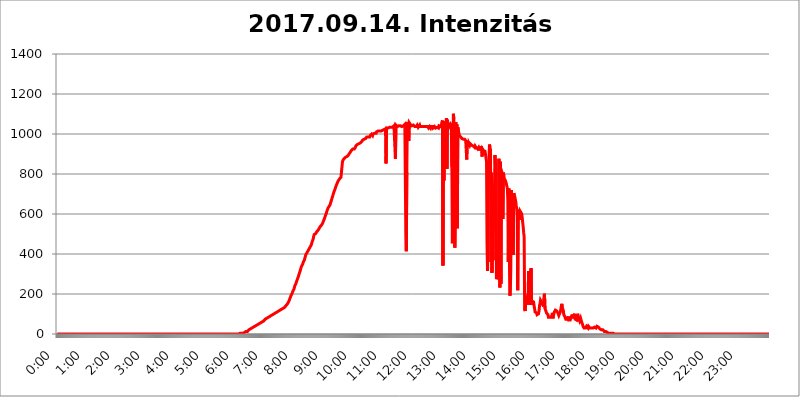
| Category | 2017.09.14. Intenzitás [W/m^2] |
|---|---|
| 0.0 | 0 |
| 0.0006944444444444445 | 0 |
| 0.001388888888888889 | 0 |
| 0.0020833333333333333 | 0 |
| 0.002777777777777778 | 0 |
| 0.003472222222222222 | 0 |
| 0.004166666666666667 | 0 |
| 0.004861111111111111 | 0 |
| 0.005555555555555556 | 0 |
| 0.0062499999999999995 | 0 |
| 0.006944444444444444 | 0 |
| 0.007638888888888889 | 0 |
| 0.008333333333333333 | 0 |
| 0.009027777777777779 | 0 |
| 0.009722222222222222 | 0 |
| 0.010416666666666666 | 0 |
| 0.011111111111111112 | 0 |
| 0.011805555555555555 | 0 |
| 0.012499999999999999 | 0 |
| 0.013194444444444444 | 0 |
| 0.013888888888888888 | 0 |
| 0.014583333333333332 | 0 |
| 0.015277777777777777 | 0 |
| 0.015972222222222224 | 0 |
| 0.016666666666666666 | 0 |
| 0.017361111111111112 | 0 |
| 0.018055555555555557 | 0 |
| 0.01875 | 0 |
| 0.019444444444444445 | 0 |
| 0.02013888888888889 | 0 |
| 0.020833333333333332 | 0 |
| 0.02152777777777778 | 0 |
| 0.022222222222222223 | 0 |
| 0.02291666666666667 | 0 |
| 0.02361111111111111 | 0 |
| 0.024305555555555556 | 0 |
| 0.024999999999999998 | 0 |
| 0.025694444444444447 | 0 |
| 0.02638888888888889 | 0 |
| 0.027083333333333334 | 0 |
| 0.027777777777777776 | 0 |
| 0.02847222222222222 | 0 |
| 0.029166666666666664 | 0 |
| 0.029861111111111113 | 0 |
| 0.030555555555555555 | 0 |
| 0.03125 | 0 |
| 0.03194444444444445 | 0 |
| 0.03263888888888889 | 0 |
| 0.03333333333333333 | 0 |
| 0.034027777777777775 | 0 |
| 0.034722222222222224 | 0 |
| 0.035416666666666666 | 0 |
| 0.036111111111111115 | 0 |
| 0.03680555555555556 | 0 |
| 0.0375 | 0 |
| 0.03819444444444444 | 0 |
| 0.03888888888888889 | 0 |
| 0.03958333333333333 | 0 |
| 0.04027777777777778 | 0 |
| 0.04097222222222222 | 0 |
| 0.041666666666666664 | 0 |
| 0.042361111111111106 | 0 |
| 0.04305555555555556 | 0 |
| 0.043750000000000004 | 0 |
| 0.044444444444444446 | 0 |
| 0.04513888888888889 | 0 |
| 0.04583333333333334 | 0 |
| 0.04652777777777778 | 0 |
| 0.04722222222222222 | 0 |
| 0.04791666666666666 | 0 |
| 0.04861111111111111 | 0 |
| 0.049305555555555554 | 0 |
| 0.049999999999999996 | 0 |
| 0.05069444444444445 | 0 |
| 0.051388888888888894 | 0 |
| 0.052083333333333336 | 0 |
| 0.05277777777777778 | 0 |
| 0.05347222222222222 | 0 |
| 0.05416666666666667 | 0 |
| 0.05486111111111111 | 0 |
| 0.05555555555555555 | 0 |
| 0.05625 | 0 |
| 0.05694444444444444 | 0 |
| 0.057638888888888885 | 0 |
| 0.05833333333333333 | 0 |
| 0.05902777777777778 | 0 |
| 0.059722222222222225 | 0 |
| 0.06041666666666667 | 0 |
| 0.061111111111111116 | 0 |
| 0.06180555555555556 | 0 |
| 0.0625 | 0 |
| 0.06319444444444444 | 0 |
| 0.06388888888888888 | 0 |
| 0.06458333333333334 | 0 |
| 0.06527777777777778 | 0 |
| 0.06597222222222222 | 0 |
| 0.06666666666666667 | 0 |
| 0.06736111111111111 | 0 |
| 0.06805555555555555 | 0 |
| 0.06874999999999999 | 0 |
| 0.06944444444444443 | 0 |
| 0.07013888888888889 | 0 |
| 0.07083333333333333 | 0 |
| 0.07152777777777779 | 0 |
| 0.07222222222222223 | 0 |
| 0.07291666666666667 | 0 |
| 0.07361111111111111 | 0 |
| 0.07430555555555556 | 0 |
| 0.075 | 0 |
| 0.07569444444444444 | 0 |
| 0.0763888888888889 | 0 |
| 0.07708333333333334 | 0 |
| 0.07777777777777778 | 0 |
| 0.07847222222222222 | 0 |
| 0.07916666666666666 | 0 |
| 0.0798611111111111 | 0 |
| 0.08055555555555556 | 0 |
| 0.08125 | 0 |
| 0.08194444444444444 | 0 |
| 0.08263888888888889 | 0 |
| 0.08333333333333333 | 0 |
| 0.08402777777777777 | 0 |
| 0.08472222222222221 | 0 |
| 0.08541666666666665 | 0 |
| 0.08611111111111112 | 0 |
| 0.08680555555555557 | 0 |
| 0.08750000000000001 | 0 |
| 0.08819444444444445 | 0 |
| 0.08888888888888889 | 0 |
| 0.08958333333333333 | 0 |
| 0.09027777777777778 | 0 |
| 0.09097222222222222 | 0 |
| 0.09166666666666667 | 0 |
| 0.09236111111111112 | 0 |
| 0.09305555555555556 | 0 |
| 0.09375 | 0 |
| 0.09444444444444444 | 0 |
| 0.09513888888888888 | 0 |
| 0.09583333333333333 | 0 |
| 0.09652777777777777 | 0 |
| 0.09722222222222222 | 0 |
| 0.09791666666666667 | 0 |
| 0.09861111111111111 | 0 |
| 0.09930555555555555 | 0 |
| 0.09999999999999999 | 0 |
| 0.10069444444444443 | 0 |
| 0.1013888888888889 | 0 |
| 0.10208333333333335 | 0 |
| 0.10277777777777779 | 0 |
| 0.10347222222222223 | 0 |
| 0.10416666666666667 | 0 |
| 0.10486111111111111 | 0 |
| 0.10555555555555556 | 0 |
| 0.10625 | 0 |
| 0.10694444444444444 | 0 |
| 0.1076388888888889 | 0 |
| 0.10833333333333334 | 0 |
| 0.10902777777777778 | 0 |
| 0.10972222222222222 | 0 |
| 0.1111111111111111 | 0 |
| 0.11180555555555556 | 0 |
| 0.11180555555555556 | 0 |
| 0.1125 | 0 |
| 0.11319444444444444 | 0 |
| 0.11388888888888889 | 0 |
| 0.11458333333333333 | 0 |
| 0.11527777777777777 | 0 |
| 0.11597222222222221 | 0 |
| 0.11666666666666665 | 0 |
| 0.1173611111111111 | 0 |
| 0.11805555555555557 | 0 |
| 0.11944444444444445 | 0 |
| 0.12013888888888889 | 0 |
| 0.12083333333333333 | 0 |
| 0.12152777777777778 | 0 |
| 0.12222222222222223 | 0 |
| 0.12291666666666667 | 0 |
| 0.12291666666666667 | 0 |
| 0.12361111111111112 | 0 |
| 0.12430555555555556 | 0 |
| 0.125 | 0 |
| 0.12569444444444444 | 0 |
| 0.12638888888888888 | 0 |
| 0.12708333333333333 | 0 |
| 0.16875 | 0 |
| 0.12847222222222224 | 0 |
| 0.12916666666666668 | 0 |
| 0.12986111111111112 | 0 |
| 0.13055555555555556 | 0 |
| 0.13125 | 0 |
| 0.13194444444444445 | 0 |
| 0.1326388888888889 | 0 |
| 0.13333333333333333 | 0 |
| 0.13402777777777777 | 0 |
| 0.13402777777777777 | 0 |
| 0.13472222222222222 | 0 |
| 0.13541666666666666 | 0 |
| 0.1361111111111111 | 0 |
| 0.13749999999999998 | 0 |
| 0.13819444444444443 | 0 |
| 0.1388888888888889 | 0 |
| 0.13958333333333334 | 0 |
| 0.14027777777777778 | 0 |
| 0.14097222222222222 | 0 |
| 0.14166666666666666 | 0 |
| 0.1423611111111111 | 0 |
| 0.14305555555555557 | 0 |
| 0.14375000000000002 | 0 |
| 0.14444444444444446 | 0 |
| 0.1451388888888889 | 0 |
| 0.1451388888888889 | 0 |
| 0.14652777777777778 | 0 |
| 0.14722222222222223 | 0 |
| 0.14791666666666667 | 0 |
| 0.1486111111111111 | 0 |
| 0.14930555555555555 | 0 |
| 0.15 | 0 |
| 0.15069444444444444 | 0 |
| 0.15138888888888888 | 0 |
| 0.15208333333333332 | 0 |
| 0.15277777777777776 | 0 |
| 0.15347222222222223 | 0 |
| 0.15416666666666667 | 0 |
| 0.15486111111111112 | 0 |
| 0.15555555555555556 | 0 |
| 0.15625 | 0 |
| 0.15694444444444444 | 0 |
| 0.15763888888888888 | 0 |
| 0.15833333333333333 | 0 |
| 0.15902777777777777 | 0 |
| 0.15972222222222224 | 0 |
| 0.16041666666666668 | 0 |
| 0.16111111111111112 | 0 |
| 0.16180555555555556 | 0 |
| 0.1625 | 0 |
| 0.16319444444444445 | 0 |
| 0.1638888888888889 | 0 |
| 0.16458333333333333 | 0 |
| 0.16527777777777777 | 0 |
| 0.16597222222222222 | 0 |
| 0.16666666666666666 | 0 |
| 0.1673611111111111 | 0 |
| 0.16805555555555554 | 0 |
| 0.16874999999999998 | 0 |
| 0.16944444444444443 | 0 |
| 0.17013888888888887 | 0 |
| 0.1708333333333333 | 0 |
| 0.17152777777777775 | 0 |
| 0.17222222222222225 | 0 |
| 0.1729166666666667 | 0 |
| 0.17361111111111113 | 0 |
| 0.17430555555555557 | 0 |
| 0.17500000000000002 | 0 |
| 0.17569444444444446 | 0 |
| 0.1763888888888889 | 0 |
| 0.17708333333333334 | 0 |
| 0.17777777777777778 | 0 |
| 0.17847222222222223 | 0 |
| 0.17916666666666667 | 0 |
| 0.1798611111111111 | 0 |
| 0.18055555555555555 | 0 |
| 0.18125 | 0 |
| 0.18194444444444444 | 0 |
| 0.1826388888888889 | 0 |
| 0.18333333333333335 | 0 |
| 0.1840277777777778 | 0 |
| 0.18472222222222223 | 0 |
| 0.18541666666666667 | 0 |
| 0.18611111111111112 | 0 |
| 0.18680555555555556 | 0 |
| 0.1875 | 0 |
| 0.18819444444444444 | 0 |
| 0.18888888888888888 | 0 |
| 0.18958333333333333 | 0 |
| 0.19027777777777777 | 0 |
| 0.1909722222222222 | 0 |
| 0.19166666666666665 | 0 |
| 0.19236111111111112 | 0 |
| 0.19305555555555554 | 0 |
| 0.19375 | 0 |
| 0.19444444444444445 | 0 |
| 0.1951388888888889 | 0 |
| 0.19583333333333333 | 0 |
| 0.19652777777777777 | 0 |
| 0.19722222222222222 | 0 |
| 0.19791666666666666 | 0 |
| 0.1986111111111111 | 0 |
| 0.19930555555555554 | 0 |
| 0.19999999999999998 | 0 |
| 0.20069444444444443 | 0 |
| 0.20138888888888887 | 0 |
| 0.2020833333333333 | 0 |
| 0.2027777777777778 | 0 |
| 0.2034722222222222 | 0 |
| 0.2041666666666667 | 0 |
| 0.20486111111111113 | 0 |
| 0.20555555555555557 | 0 |
| 0.20625000000000002 | 0 |
| 0.20694444444444446 | 0 |
| 0.2076388888888889 | 0 |
| 0.20833333333333334 | 0 |
| 0.20902777777777778 | 0 |
| 0.20972222222222223 | 0 |
| 0.21041666666666667 | 0 |
| 0.2111111111111111 | 0 |
| 0.21180555555555555 | 0 |
| 0.2125 | 0 |
| 0.21319444444444444 | 0 |
| 0.2138888888888889 | 0 |
| 0.21458333333333335 | 0 |
| 0.2152777777777778 | 0 |
| 0.21597222222222223 | 0 |
| 0.21666666666666667 | 0 |
| 0.21736111111111112 | 0 |
| 0.21805555555555556 | 0 |
| 0.21875 | 0 |
| 0.21944444444444444 | 0 |
| 0.22013888888888888 | 0 |
| 0.22083333333333333 | 0 |
| 0.22152777777777777 | 0 |
| 0.2222222222222222 | 0 |
| 0.22291666666666665 | 0 |
| 0.2236111111111111 | 0 |
| 0.22430555555555556 | 0 |
| 0.225 | 0 |
| 0.22569444444444445 | 0 |
| 0.2263888888888889 | 0 |
| 0.22708333333333333 | 0 |
| 0.22777777777777777 | 0 |
| 0.22847222222222222 | 0 |
| 0.22916666666666666 | 0 |
| 0.2298611111111111 | 0 |
| 0.23055555555555554 | 0 |
| 0.23124999999999998 | 0 |
| 0.23194444444444443 | 0 |
| 0.23263888888888887 | 0 |
| 0.2333333333333333 | 0 |
| 0.2340277777777778 | 0 |
| 0.2347222222222222 | 0 |
| 0.2354166666666667 | 0 |
| 0.23611111111111113 | 0 |
| 0.23680555555555557 | 0 |
| 0.23750000000000002 | 0 |
| 0.23819444444444446 | 0 |
| 0.2388888888888889 | 0 |
| 0.23958333333333334 | 0 |
| 0.24027777777777778 | 0 |
| 0.24097222222222223 | 0 |
| 0.24166666666666667 | 0 |
| 0.2423611111111111 | 0 |
| 0.24305555555555555 | 0 |
| 0.24375 | 0 |
| 0.24444444444444446 | 0 |
| 0.24513888888888888 | 0 |
| 0.24583333333333335 | 0 |
| 0.2465277777777778 | 0 |
| 0.24722222222222223 | 0 |
| 0.24791666666666667 | 0 |
| 0.24861111111111112 | 0 |
| 0.24930555555555556 | 0 |
| 0.25 | 0 |
| 0.25069444444444444 | 0 |
| 0.2513888888888889 | 0 |
| 0.2520833333333333 | 0 |
| 0.25277777777777777 | 0 |
| 0.2534722222222222 | 0 |
| 0.25416666666666665 | 0 |
| 0.2548611111111111 | 3.525 |
| 0.2555555555555556 | 3.525 |
| 0.25625000000000003 | 3.525 |
| 0.2569444444444445 | 3.525 |
| 0.2576388888888889 | 3.525 |
| 0.25833333333333336 | 3.525 |
| 0.2590277777777778 | 3.525 |
| 0.25972222222222224 | 3.525 |
| 0.2604166666666667 | 3.525 |
| 0.2611111111111111 | 3.525 |
| 0.26180555555555557 | 7.887 |
| 0.2625 | 7.887 |
| 0.26319444444444445 | 7.887 |
| 0.2638888888888889 | 7.887 |
| 0.26458333333333334 | 12.257 |
| 0.2652777777777778 | 12.257 |
| 0.2659722222222222 | 12.257 |
| 0.26666666666666666 | 12.257 |
| 0.2673611111111111 | 16.636 |
| 0.26805555555555555 | 16.636 |
| 0.26875 | 21.024 |
| 0.26944444444444443 | 21.024 |
| 0.2701388888888889 | 21.024 |
| 0.2708333333333333 | 25.419 |
| 0.27152777777777776 | 25.419 |
| 0.2722222222222222 | 25.419 |
| 0.27291666666666664 | 29.823 |
| 0.2736111111111111 | 29.823 |
| 0.2743055555555555 | 29.823 |
| 0.27499999999999997 | 34.234 |
| 0.27569444444444446 | 34.234 |
| 0.27638888888888885 | 34.234 |
| 0.27708333333333335 | 38.653 |
| 0.2777777777777778 | 38.653 |
| 0.27847222222222223 | 38.653 |
| 0.2791666666666667 | 43.079 |
| 0.2798611111111111 | 43.079 |
| 0.28055555555555556 | 43.079 |
| 0.28125 | 47.511 |
| 0.28194444444444444 | 47.511 |
| 0.2826388888888889 | 47.511 |
| 0.2833333333333333 | 51.951 |
| 0.28402777777777777 | 56.398 |
| 0.2847222222222222 | 56.398 |
| 0.28541666666666665 | 56.398 |
| 0.28611111111111115 | 56.398 |
| 0.28680555555555554 | 60.85 |
| 0.28750000000000003 | 60.85 |
| 0.2881944444444445 | 65.31 |
| 0.2888888888888889 | 65.31 |
| 0.28958333333333336 | 65.31 |
| 0.2902777777777778 | 69.775 |
| 0.29097222222222224 | 69.775 |
| 0.2916666666666667 | 74.246 |
| 0.2923611111111111 | 74.246 |
| 0.29305555555555557 | 74.246 |
| 0.29375 | 78.722 |
| 0.29444444444444445 | 78.722 |
| 0.2951388888888889 | 83.205 |
| 0.29583333333333334 | 83.205 |
| 0.2965277777777778 | 83.205 |
| 0.2972222222222222 | 83.205 |
| 0.29791666666666666 | 87.692 |
| 0.2986111111111111 | 87.692 |
| 0.29930555555555555 | 92.184 |
| 0.3 | 92.184 |
| 0.30069444444444443 | 92.184 |
| 0.3013888888888889 | 92.184 |
| 0.3020833333333333 | 96.682 |
| 0.30277777777777776 | 96.682 |
| 0.3034722222222222 | 101.184 |
| 0.30416666666666664 | 101.184 |
| 0.3048611111111111 | 101.184 |
| 0.3055555555555555 | 105.69 |
| 0.30624999999999997 | 105.69 |
| 0.3069444444444444 | 105.69 |
| 0.3076388888888889 | 110.201 |
| 0.30833333333333335 | 110.201 |
| 0.3090277777777778 | 114.716 |
| 0.30972222222222223 | 114.716 |
| 0.3104166666666667 | 114.716 |
| 0.3111111111111111 | 119.235 |
| 0.31180555555555556 | 119.235 |
| 0.3125 | 119.235 |
| 0.31319444444444444 | 119.235 |
| 0.3138888888888889 | 123.758 |
| 0.3145833333333333 | 123.758 |
| 0.31527777777777777 | 128.284 |
| 0.3159722222222222 | 128.284 |
| 0.31666666666666665 | 128.284 |
| 0.31736111111111115 | 128.284 |
| 0.31805555555555554 | 132.814 |
| 0.31875000000000003 | 132.814 |
| 0.3194444444444445 | 137.347 |
| 0.3201388888888889 | 137.347 |
| 0.32083333333333336 | 141.884 |
| 0.3215277777777778 | 141.884 |
| 0.32222222222222224 | 146.423 |
| 0.3229166666666667 | 150.964 |
| 0.3236111111111111 | 155.509 |
| 0.32430555555555557 | 155.509 |
| 0.325 | 164.605 |
| 0.32569444444444445 | 169.156 |
| 0.3263888888888889 | 178.264 |
| 0.32708333333333334 | 182.82 |
| 0.3277777777777778 | 191.937 |
| 0.3284722222222222 | 196.497 |
| 0.32916666666666666 | 201.058 |
| 0.3298611111111111 | 205.62 |
| 0.33055555555555555 | 214.746 |
| 0.33125 | 219.309 |
| 0.33194444444444443 | 223.873 |
| 0.3326388888888889 | 233 |
| 0.3333333333333333 | 242.127 |
| 0.3340277777777778 | 246.689 |
| 0.3347222222222222 | 251.251 |
| 0.3354166666666667 | 260.373 |
| 0.3361111111111111 | 264.932 |
| 0.3368055555555556 | 274.047 |
| 0.33749999999999997 | 278.603 |
| 0.33819444444444446 | 287.709 |
| 0.33888888888888885 | 296.808 |
| 0.33958333333333335 | 301.354 |
| 0.34027777777777773 | 310.44 |
| 0.34097222222222223 | 319.517 |
| 0.3416666666666666 | 328.584 |
| 0.3423611111111111 | 333.113 |
| 0.3430555555555555 | 342.162 |
| 0.34375 | 346.682 |
| 0.3444444444444445 | 351.198 |
| 0.3451388888888889 | 360.221 |
| 0.3458333333333334 | 364.728 |
| 0.34652777777777777 | 369.23 |
| 0.34722222222222227 | 378.224 |
| 0.34791666666666665 | 387.202 |
| 0.34861111111111115 | 396.164 |
| 0.34930555555555554 | 400.638 |
| 0.35000000000000003 | 405.108 |
| 0.3506944444444444 | 409.574 |
| 0.3513888888888889 | 414.035 |
| 0.3520833333333333 | 414.035 |
| 0.3527777777777778 | 418.492 |
| 0.3534722222222222 | 427.39 |
| 0.3541666666666667 | 431.833 |
| 0.3548611111111111 | 436.27 |
| 0.35555555555555557 | 440.702 |
| 0.35625 | 445.129 |
| 0.35694444444444445 | 453.968 |
| 0.3576388888888889 | 462.786 |
| 0.35833333333333334 | 467.187 |
| 0.3590277777777778 | 475.972 |
| 0.3597222222222222 | 489.108 |
| 0.36041666666666666 | 497.836 |
| 0.3611111111111111 | 497.836 |
| 0.36180555555555555 | 497.836 |
| 0.3625 | 502.192 |
| 0.36319444444444443 | 506.542 |
| 0.3638888888888889 | 510.885 |
| 0.3645833333333333 | 515.223 |
| 0.3652777777777778 | 515.223 |
| 0.3659722222222222 | 519.555 |
| 0.3666666666666667 | 523.88 |
| 0.3673611111111111 | 528.2 |
| 0.3680555555555556 | 532.513 |
| 0.36874999999999997 | 536.82 |
| 0.36944444444444446 | 536.82 |
| 0.37013888888888885 | 541.121 |
| 0.37083333333333335 | 545.416 |
| 0.37152777777777773 | 545.416 |
| 0.37222222222222223 | 553.986 |
| 0.3729166666666666 | 558.261 |
| 0.3736111111111111 | 566.793 |
| 0.3743055555555555 | 571.049 |
| 0.375 | 579.542 |
| 0.3756944444444445 | 588.009 |
| 0.3763888888888889 | 592.233 |
| 0.3770833333333334 | 600.661 |
| 0.37777777777777777 | 609.062 |
| 0.37847222222222227 | 617.436 |
| 0.37916666666666665 | 621.613 |
| 0.37986111111111115 | 629.948 |
| 0.38055555555555554 | 634.105 |
| 0.38125000000000003 | 638.256 |
| 0.3819444444444444 | 642.4 |
| 0.3826388888888889 | 646.537 |
| 0.3833333333333333 | 654.791 |
| 0.3840277777777778 | 663.019 |
| 0.3847222222222222 | 671.22 |
| 0.3854166666666667 | 675.311 |
| 0.3861111111111111 | 687.544 |
| 0.38680555555555557 | 695.666 |
| 0.3875 | 703.762 |
| 0.38819444444444445 | 711.832 |
| 0.3888888888888889 | 715.858 |
| 0.38958333333333334 | 723.889 |
| 0.3902777777777778 | 727.896 |
| 0.3909722222222222 | 739.877 |
| 0.39166666666666666 | 743.859 |
| 0.3923611111111111 | 751.803 |
| 0.39305555555555555 | 755.766 |
| 0.39375 | 763.674 |
| 0.39444444444444443 | 763.674 |
| 0.3951388888888889 | 767.62 |
| 0.3958333333333333 | 775.492 |
| 0.3965277777777778 | 775.492 |
| 0.3972222222222222 | 779.42 |
| 0.3979166666666667 | 783.342 |
| 0.3986111111111111 | 783.342 |
| 0.3993055555555556 | 787.258 |
| 0.39999999999999997 | 860.676 |
| 0.40069444444444446 | 868.305 |
| 0.40138888888888885 | 868.305 |
| 0.40208333333333335 | 875.918 |
| 0.40277777777777773 | 879.719 |
| 0.40347222222222223 | 879.719 |
| 0.4041666666666666 | 883.516 |
| 0.4048611111111111 | 883.516 |
| 0.4055555555555555 | 887.309 |
| 0.40625 | 887.309 |
| 0.4069444444444445 | 887.309 |
| 0.4076388888888889 | 891.099 |
| 0.4083333333333334 | 894.885 |
| 0.40902777777777777 | 898.668 |
| 0.40972222222222227 | 902.447 |
| 0.41041666666666665 | 906.223 |
| 0.41111111111111115 | 909.996 |
| 0.41180555555555554 | 913.766 |
| 0.41250000000000003 | 917.534 |
| 0.4131944444444444 | 917.534 |
| 0.4138888888888889 | 921.298 |
| 0.4145833333333333 | 925.06 |
| 0.4152777777777778 | 925.06 |
| 0.4159722222222222 | 925.06 |
| 0.4166666666666667 | 925.06 |
| 0.4173611111111111 | 928.819 |
| 0.41805555555555557 | 932.576 |
| 0.41875 | 940.082 |
| 0.41944444444444445 | 936.33 |
| 0.4201388888888889 | 940.082 |
| 0.42083333333333334 | 947.58 |
| 0.4215277777777778 | 947.58 |
| 0.4222222222222222 | 947.58 |
| 0.42291666666666666 | 951.327 |
| 0.4236111111111111 | 955.071 |
| 0.42430555555555555 | 955.071 |
| 0.425 | 955.071 |
| 0.42569444444444443 | 955.071 |
| 0.4263888888888889 | 958.814 |
| 0.4270833333333333 | 962.555 |
| 0.4277777777777778 | 966.295 |
| 0.4284722222222222 | 970.034 |
| 0.4291666666666667 | 970.034 |
| 0.4298611111111111 | 970.034 |
| 0.4305555555555556 | 973.772 |
| 0.43124999999999997 | 970.034 |
| 0.43194444444444446 | 977.508 |
| 0.43263888888888885 | 977.508 |
| 0.43333333333333335 | 977.508 |
| 0.43402777777777773 | 984.98 |
| 0.43472222222222223 | 984.98 |
| 0.4354166666666666 | 984.98 |
| 0.4361111111111111 | 984.98 |
| 0.4368055555555555 | 988.714 |
| 0.4375 | 988.714 |
| 0.4381944444444445 | 984.98 |
| 0.4388888888888889 | 992.448 |
| 0.4395833333333334 | 988.714 |
| 0.44027777777777777 | 992.448 |
| 0.44097222222222227 | 999.916 |
| 0.44166666666666665 | 999.916 |
| 0.44236111111111115 | 992.448 |
| 0.44305555555555554 | 999.916 |
| 0.44375000000000003 | 999.916 |
| 0.4444444444444444 | 999.916 |
| 0.4451388888888889 | 1003.65 |
| 0.4458333333333333 | 1003.65 |
| 0.4465277777777778 | 1003.65 |
| 0.4472222222222222 | 1003.65 |
| 0.4479166666666667 | 1011.118 |
| 0.4486111111111111 | 1011.118 |
| 0.44930555555555557 | 1011.118 |
| 0.45 | 1014.852 |
| 0.45069444444444445 | 1014.852 |
| 0.4513888888888889 | 1011.118 |
| 0.45208333333333334 | 1014.852 |
| 0.4527777777777778 | 1014.852 |
| 0.4534722222222222 | 1018.587 |
| 0.45416666666666666 | 1014.852 |
| 0.4548611111111111 | 1014.852 |
| 0.45555555555555555 | 1018.587 |
| 0.45625 | 1018.587 |
| 0.45694444444444443 | 1018.587 |
| 0.4576388888888889 | 1022.323 |
| 0.4583333333333333 | 1022.323 |
| 0.4590277777777778 | 1018.587 |
| 0.4597222222222222 | 1022.323 |
| 0.4604166666666667 | 1026.06 |
| 0.4611111111111111 | 853.029 |
| 0.4618055555555556 | 1029.798 |
| 0.46249999999999997 | 1029.798 |
| 0.46319444444444446 | 1033.537 |
| 0.46388888888888885 | 1029.798 |
| 0.46458333333333335 | 1029.798 |
| 0.46527777777777773 | 1029.798 |
| 0.46597222222222223 | 1033.537 |
| 0.4666666666666666 | 1033.537 |
| 0.4673611111111111 | 1029.798 |
| 0.4680555555555555 | 1033.537 |
| 0.46875 | 1029.798 |
| 0.4694444444444445 | 1033.537 |
| 0.4701388888888889 | 1033.537 |
| 0.4708333333333334 | 1033.537 |
| 0.47152777777777777 | 1033.537 |
| 0.47222222222222227 | 1041.019 |
| 0.47291666666666665 | 1041.019 |
| 0.47361111111111115 | 1037.277 |
| 0.47430555555555554 | 875.918 |
| 0.47500000000000003 | 1044.762 |
| 0.4756944444444444 | 1048.508 |
| 0.4763888888888889 | 1044.762 |
| 0.4770833333333333 | 1037.277 |
| 0.4777777777777778 | 1041.019 |
| 0.4784722222222222 | 1037.277 |
| 0.4791666666666667 | 1041.019 |
| 0.4798611111111111 | 1041.019 |
| 0.48055555555555557 | 1037.277 |
| 0.48125 | 1041.019 |
| 0.48194444444444445 | 1037.277 |
| 0.4826388888888889 | 1037.277 |
| 0.48333333333333334 | 1037.277 |
| 0.4840277777777778 | 1033.537 |
| 0.4847222222222222 | 1037.277 |
| 0.48541666666666666 | 1041.019 |
| 0.4861111111111111 | 1041.019 |
| 0.48680555555555555 | 1037.277 |
| 0.4875 | 1048.508 |
| 0.48819444444444443 | 1052.255 |
| 0.4888888888888889 | 506.542 |
| 0.4895833333333333 | 414.035 |
| 0.4902777777777778 | 810.641 |
| 0.4909722222222222 | 1059.756 |
| 0.4916666666666667 | 1059.756 |
| 0.4923611111111111 | 1056.004 |
| 0.4930555555555556 | 966.295 |
| 0.49374999999999997 | 1056.004 |
| 0.49444444444444446 | 1052.255 |
| 0.49513888888888885 | 1048.508 |
| 0.49583333333333335 | 1044.762 |
| 0.49652777777777773 | 1044.762 |
| 0.49722222222222223 | 1041.019 |
| 0.4979166666666666 | 1044.762 |
| 0.4986111111111111 | 1041.019 |
| 0.4993055555555555 | 1044.762 |
| 0.5 | 1044.762 |
| 0.5006944444444444 | 1041.019 |
| 0.5013888888888889 | 1037.277 |
| 0.5020833333333333 | 1037.277 |
| 0.5027777777777778 | 1041.019 |
| 0.5034722222222222 | 1037.277 |
| 0.5041666666666667 | 1037.277 |
| 0.5048611111111111 | 1044.762 |
| 0.5055555555555555 | 1044.762 |
| 0.50625 | 1033.537 |
| 0.5069444444444444 | 1037.277 |
| 0.5076388888888889 | 1037.277 |
| 0.5083333333333333 | 1044.762 |
| 0.5090277777777777 | 1037.277 |
| 0.5097222222222222 | 1033.537 |
| 0.5104166666666666 | 1037.277 |
| 0.5111111111111112 | 1037.277 |
| 0.5118055555555555 | 1037.277 |
| 0.5125000000000001 | 1041.019 |
| 0.5131944444444444 | 1037.277 |
| 0.513888888888889 | 1037.277 |
| 0.5145833333333333 | 1033.537 |
| 0.5152777777777778 | 1037.277 |
| 0.5159722222222222 | 1037.277 |
| 0.5166666666666667 | 1037.277 |
| 0.517361111111111 | 1037.277 |
| 0.5180555555555556 | 1037.277 |
| 0.5187499999999999 | 1037.277 |
| 0.5194444444444445 | 1037.277 |
| 0.5201388888888888 | 1037.277 |
| 0.5208333333333334 | 1029.798 |
| 0.5215277777777778 | 1033.537 |
| 0.5222222222222223 | 1037.277 |
| 0.5229166666666667 | 1037.277 |
| 0.5236111111111111 | 1029.798 |
| 0.5243055555555556 | 1037.277 |
| 0.525 | 1033.537 |
| 0.5256944444444445 | 1037.277 |
| 0.5263888888888889 | 1037.277 |
| 0.5270833333333333 | 1029.798 |
| 0.5277777777777778 | 1033.537 |
| 0.5284722222222222 | 1033.537 |
| 0.5291666666666667 | 1037.277 |
| 0.5298611111111111 | 1033.537 |
| 0.5305555555555556 | 1029.798 |
| 0.53125 | 1029.798 |
| 0.5319444444444444 | 1033.537 |
| 0.5326388888888889 | 1033.537 |
| 0.5333333333333333 | 1029.798 |
| 0.5340277777777778 | 1029.798 |
| 0.5347222222222222 | 1029.798 |
| 0.5354166666666667 | 1041.019 |
| 0.5361111111111111 | 1037.277 |
| 0.5368055555555555 | 1037.277 |
| 0.5375 | 1037.277 |
| 0.5381944444444444 | 1041.019 |
| 0.5388888888888889 | 1048.508 |
| 0.5395833333333333 | 1059.756 |
| 0.5402777777777777 | 1067.267 |
| 0.5409722222222222 | 342.162 |
| 0.5416666666666666 | 981.244 |
| 0.5423611111111112 | 767.62 |
| 0.5430555555555555 | 1063.51 |
| 0.5437500000000001 | 1056.004 |
| 0.5444444444444444 | 1037.277 |
| 0.545138888888889 | 829.981 |
| 0.5458333333333333 | 1078.555 |
| 0.5465277777777778 | 826.123 |
| 0.5472222222222222 | 1071.027 |
| 0.5479166666666667 | 1048.508 |
| 0.548611111111111 | 1029.798 |
| 0.5493055555555556 | 1029.798 |
| 0.5499999999999999 | 1041.019 |
| 0.5506944444444445 | 1041.019 |
| 0.5513888888888888 | 1048.508 |
| 0.5520833333333334 | 1041.019 |
| 0.5527777777777778 | 1052.255 |
| 0.5534722222222223 | 833.834 |
| 0.5541666666666667 | 453.968 |
| 0.5548611111111111 | 571.049 |
| 0.5555555555555556 | 1101.226 |
| 0.55625 | 1074.789 |
| 0.5569444444444445 | 739.877 |
| 0.5576388888888889 | 431.833 |
| 0.5583333333333333 | 671.22 |
| 0.5590277777777778 | 1059.756 |
| 0.5597222222222222 | 917.534 |
| 0.5604166666666667 | 1048.508 |
| 0.5611111111111111 | 528.2 |
| 0.5618055555555556 | 1033.537 |
| 0.5625 | 1014.852 |
| 0.5631944444444444 | 1007.383 |
| 0.5638888888888889 | 992.448 |
| 0.5645833333333333 | 992.448 |
| 0.5652777777777778 | 988.714 |
| 0.5659722222222222 | 984.98 |
| 0.5666666666666667 | 984.98 |
| 0.5673611111111111 | 977.508 |
| 0.5680555555555555 | 981.244 |
| 0.56875 | 973.772 |
| 0.5694444444444444 | 973.772 |
| 0.5701388888888889 | 970.034 |
| 0.5708333333333333 | 973.772 |
| 0.5715277777777777 | 973.772 |
| 0.5722222222222222 | 970.034 |
| 0.5729166666666666 | 966.295 |
| 0.5736111111111112 | 970.034 |
| 0.5743055555555555 | 872.114 |
| 0.5750000000000001 | 966.295 |
| 0.5756944444444444 | 958.814 |
| 0.576388888888889 | 936.33 |
| 0.5770833333333333 | 955.071 |
| 0.5777777777777778 | 951.327 |
| 0.5784722222222222 | 943.832 |
| 0.5791666666666667 | 951.327 |
| 0.579861111111111 | 947.58 |
| 0.5805555555555556 | 947.58 |
| 0.5812499999999999 | 943.832 |
| 0.5819444444444445 | 943.832 |
| 0.5826388888888888 | 943.832 |
| 0.5833333333333334 | 940.082 |
| 0.5840277777777778 | 940.082 |
| 0.5847222222222223 | 940.082 |
| 0.5854166666666667 | 932.576 |
| 0.5861111111111111 | 940.082 |
| 0.5868055555555556 | 936.33 |
| 0.5875 | 932.576 |
| 0.5881944444444445 | 932.576 |
| 0.5888888888888889 | 932.576 |
| 0.5895833333333333 | 925.06 |
| 0.5902777777777778 | 928.819 |
| 0.5909722222222222 | 932.576 |
| 0.5916666666666667 | 925.06 |
| 0.5923611111111111 | 917.534 |
| 0.5930555555555556 | 932.576 |
| 0.59375 | 936.33 |
| 0.5944444444444444 | 932.576 |
| 0.5951388888888889 | 932.576 |
| 0.5958333333333333 | 887.309 |
| 0.5965277777777778 | 925.06 |
| 0.5972222222222222 | 921.298 |
| 0.5979166666666667 | 917.534 |
| 0.5986111111111111 | 917.534 |
| 0.5993055555555555 | 917.534 |
| 0.6 | 913.766 |
| 0.6006944444444444 | 909.996 |
| 0.6013888888888889 | 917.534 |
| 0.6020833333333333 | 860.676 |
| 0.6027777777777777 | 449.551 |
| 0.6034722222222222 | 314.98 |
| 0.6041666666666666 | 588.009 |
| 0.6048611111111112 | 837.682 |
| 0.6055555555555555 | 879.719 |
| 0.6062500000000001 | 947.58 |
| 0.6069444444444444 | 932.576 |
| 0.607638888888889 | 921.298 |
| 0.6083333333333333 | 360.221 |
| 0.6090277777777778 | 806.757 |
| 0.6097222222222222 | 305.898 |
| 0.6104166666666667 | 506.542 |
| 0.611111111111111 | 369.23 |
| 0.6118055555555556 | 575.299 |
| 0.6124999999999999 | 566.793 |
| 0.6131944444444445 | 723.889 |
| 0.6138888888888888 | 894.885 |
| 0.6145833333333334 | 894.885 |
| 0.6152777777777778 | 795.074 |
| 0.6159722222222223 | 274.047 |
| 0.6166666666666667 | 283.156 |
| 0.6173611111111111 | 278.603 |
| 0.6180555555555556 | 283.156 |
| 0.61875 | 296.808 |
| 0.6194444444444445 | 875.918 |
| 0.6201388888888889 | 502.192 |
| 0.6208333333333333 | 233 |
| 0.6215277777777778 | 860.676 |
| 0.6222222222222222 | 251.251 |
| 0.6229166666666667 | 802.868 |
| 0.6236111111111111 | 810.641 |
| 0.6243055555555556 | 802.868 |
| 0.625 | 575.299 |
| 0.6256944444444444 | 806.757 |
| 0.6263888888888889 | 791.169 |
| 0.6270833333333333 | 775.492 |
| 0.6277777777777778 | 775.492 |
| 0.6284722222222222 | 767.62 |
| 0.6291666666666667 | 759.723 |
| 0.6298611111111111 | 751.803 |
| 0.6305555555555555 | 751.803 |
| 0.63125 | 727.896 |
| 0.6319444444444444 | 671.22 |
| 0.6326388888888889 | 360.221 |
| 0.6333333333333333 | 727.896 |
| 0.6340277777777777 | 436.27 |
| 0.6347222222222222 | 191.937 |
| 0.6354166666666666 | 201.058 |
| 0.6361111111111112 | 324.052 |
| 0.6368055555555555 | 719.877 |
| 0.6375000000000001 | 719.877 |
| 0.6381944444444444 | 650.667 |
| 0.638888888888889 | 427.39 |
| 0.6395833333333333 | 396.164 |
| 0.6402777777777778 | 703.762 |
| 0.6409722222222222 | 695.666 |
| 0.6416666666666667 | 687.544 |
| 0.642361111111111 | 675.311 |
| 0.6430555555555556 | 663.019 |
| 0.6437499999999999 | 642.4 |
| 0.6444444444444445 | 625.784 |
| 0.6451388888888888 | 600.661 |
| 0.6458333333333334 | 219.309 |
| 0.6465277777777778 | 621.613 |
| 0.6472222222222223 | 617.436 |
| 0.6479166666666667 | 600.661 |
| 0.6486111111111111 | 571.049 |
| 0.6493055555555556 | 613.252 |
| 0.65 | 609.062 |
| 0.6506944444444445 | 609.062 |
| 0.6513888888888889 | 600.661 |
| 0.6520833333333333 | 583.779 |
| 0.6527777777777778 | 558.261 |
| 0.6534722222222222 | 536.82 |
| 0.6541666666666667 | 506.542 |
| 0.6548611111111111 | 484.735 |
| 0.6555555555555556 | 123.758 |
| 0.65625 | 114.716 |
| 0.6569444444444444 | 160.056 |
| 0.6576388888888889 | 146.423 |
| 0.6583333333333333 | 150.964 |
| 0.6590277777777778 | 169.156 |
| 0.6597222222222222 | 191.937 |
| 0.6604166666666667 | 205.62 |
| 0.6611111111111111 | 314.98 |
| 0.6618055555555555 | 169.156 |
| 0.6625 | 146.423 |
| 0.6631944444444444 | 141.884 |
| 0.6638888888888889 | 146.423 |
| 0.6645833333333333 | 328.584 |
| 0.6652777777777777 | 146.423 |
| 0.6659722222222222 | 164.605 |
| 0.6666666666666666 | 164.605 |
| 0.6673611111111111 | 164.605 |
| 0.6680555555555556 | 160.056 |
| 0.6687500000000001 | 141.884 |
| 0.6694444444444444 | 128.284 |
| 0.6701388888888888 | 110.201 |
| 0.6708333333333334 | 105.69 |
| 0.6715277777777778 | 110.201 |
| 0.6722222222222222 | 105.69 |
| 0.6729166666666666 | 96.682 |
| 0.6736111111111112 | 96.682 |
| 0.6743055555555556 | 92.184 |
| 0.6749999999999999 | 101.184 |
| 0.6756944444444444 | 114.716 |
| 0.6763888888888889 | 141.884 |
| 0.6770833333333334 | 150.964 |
| 0.6777777777777777 | 169.156 |
| 0.6784722222222223 | 169.156 |
| 0.6791666666666667 | 169.156 |
| 0.6798611111111111 | 155.509 |
| 0.6805555555555555 | 150.964 |
| 0.68125 | 150.964 |
| 0.6819444444444445 | 137.347 |
| 0.6826388888888889 | 132.814 |
| 0.6833333333333332 | 201.058 |
| 0.6840277777777778 | 128.284 |
| 0.6847222222222222 | 128.284 |
| 0.6854166666666667 | 114.716 |
| 0.686111111111111 | 105.69 |
| 0.6868055555555556 | 101.184 |
| 0.6875 | 105.69 |
| 0.6881944444444444 | 96.682 |
| 0.688888888888889 | 83.205 |
| 0.6895833333333333 | 78.722 |
| 0.6902777777777778 | 78.722 |
| 0.6909722222222222 | 83.205 |
| 0.6916666666666668 | 87.692 |
| 0.6923611111111111 | 83.205 |
| 0.6930555555555555 | 83.205 |
| 0.69375 | 78.722 |
| 0.6944444444444445 | 105.69 |
| 0.6951388888888889 | 78.722 |
| 0.6958333333333333 | 87.692 |
| 0.6965277777777777 | 101.184 |
| 0.6972222222222223 | 110.201 |
| 0.6979166666666666 | 114.716 |
| 0.6986111111111111 | 119.235 |
| 0.6993055555555556 | 119.235 |
| 0.7000000000000001 | 119.235 |
| 0.7006944444444444 | 114.716 |
| 0.7013888888888888 | 110.201 |
| 0.7020833333333334 | 105.69 |
| 0.7027777777777778 | 101.184 |
| 0.7034722222222222 | 92.184 |
| 0.7041666666666666 | 92.184 |
| 0.7048611111111112 | 92.184 |
| 0.7055555555555556 | 110.201 |
| 0.7062499999999999 | 110.201 |
| 0.7069444444444444 | 137.347 |
| 0.7076388888888889 | 150.964 |
| 0.7083333333333334 | 128.284 |
| 0.7090277777777777 | 123.758 |
| 0.7097222222222223 | 119.235 |
| 0.7104166666666667 | 96.682 |
| 0.7111111111111111 | 92.184 |
| 0.7118055555555555 | 87.692 |
| 0.7125 | 87.692 |
| 0.7131944444444445 | 74.246 |
| 0.7138888888888889 | 74.246 |
| 0.7145833333333332 | 69.775 |
| 0.7152777777777778 | 74.246 |
| 0.7159722222222222 | 74.246 |
| 0.7166666666666667 | 87.692 |
| 0.717361111111111 | 69.775 |
| 0.7180555555555556 | 69.775 |
| 0.71875 | 69.775 |
| 0.7194444444444444 | 69.775 |
| 0.720138888888889 | 65.31 |
| 0.7208333333333333 | 83.205 |
| 0.7215277777777778 | 87.692 |
| 0.7222222222222222 | 96.682 |
| 0.7229166666666668 | 78.722 |
| 0.7236111111111111 | 96.682 |
| 0.7243055555555555 | 83.205 |
| 0.725 | 87.692 |
| 0.7256944444444445 | 101.184 |
| 0.7263888888888889 | 74.246 |
| 0.7270833333333333 | 69.775 |
| 0.7277777777777777 | 69.775 |
| 0.7284722222222223 | 69.775 |
| 0.7291666666666666 | 74.246 |
| 0.7298611111111111 | 101.184 |
| 0.7305555555555556 | 87.692 |
| 0.7312500000000001 | 78.722 |
| 0.7319444444444444 | 74.246 |
| 0.7326388888888888 | 65.31 |
| 0.7333333333333334 | 69.775 |
| 0.7340277777777778 | 78.722 |
| 0.7347222222222222 | 83.205 |
| 0.7354166666666666 | 60.85 |
| 0.7361111111111112 | 56.398 |
| 0.7368055555555556 | 47.511 |
| 0.7374999999999999 | 38.653 |
| 0.7381944444444444 | 34.234 |
| 0.7388888888888889 | 29.823 |
| 0.7395833333333334 | 25.419 |
| 0.7402777777777777 | 29.823 |
| 0.7409722222222223 | 29.823 |
| 0.7416666666666667 | 34.234 |
| 0.7423611111111111 | 38.653 |
| 0.7430555555555555 | 34.234 |
| 0.74375 | 34.234 |
| 0.7444444444444445 | 29.823 |
| 0.7451388888888889 | 38.653 |
| 0.7458333333333332 | 38.653 |
| 0.7465277777777778 | 34.234 |
| 0.7472222222222222 | 29.823 |
| 0.7479166666666667 | 29.823 |
| 0.748611111111111 | 29.823 |
| 0.7493055555555556 | 29.823 |
| 0.75 | 29.823 |
| 0.7506944444444444 | 29.823 |
| 0.751388888888889 | 29.823 |
| 0.7520833333333333 | 34.234 |
| 0.7527777777777778 | 34.234 |
| 0.7534722222222222 | 34.234 |
| 0.7541666666666668 | 29.823 |
| 0.7548611111111111 | 29.823 |
| 0.7555555555555555 | 29.823 |
| 0.75625 | 34.234 |
| 0.7569444444444445 | 38.653 |
| 0.7576388888888889 | 38.653 |
| 0.7583333333333333 | 34.234 |
| 0.7590277777777777 | 34.234 |
| 0.7597222222222223 | 34.234 |
| 0.7604166666666666 | 29.823 |
| 0.7611111111111111 | 25.419 |
| 0.7618055555555556 | 25.419 |
| 0.7625000000000001 | 25.419 |
| 0.7631944444444444 | 21.024 |
| 0.7638888888888888 | 21.024 |
| 0.7645833333333334 | 21.024 |
| 0.7652777777777778 | 21.024 |
| 0.7659722222222222 | 16.636 |
| 0.7666666666666666 | 16.636 |
| 0.7673611111111112 | 12.257 |
| 0.7680555555555556 | 12.257 |
| 0.7687499999999999 | 12.257 |
| 0.7694444444444444 | 12.257 |
| 0.7701388888888889 | 12.257 |
| 0.7708333333333334 | 12.257 |
| 0.7715277777777777 | 7.887 |
| 0.7722222222222223 | 7.887 |
| 0.7729166666666667 | 7.887 |
| 0.7736111111111111 | 3.525 |
| 0.7743055555555555 | 3.525 |
| 0.775 | 3.525 |
| 0.7756944444444445 | 3.525 |
| 0.7763888888888889 | 3.525 |
| 0.7770833333333332 | 3.525 |
| 0.7777777777777778 | 3.525 |
| 0.7784722222222222 | 3.525 |
| 0.7791666666666667 | 3.525 |
| 0.779861111111111 | 3.525 |
| 0.7805555555555556 | 0 |
| 0.78125 | 3.525 |
| 0.7819444444444444 | 0 |
| 0.782638888888889 | 0 |
| 0.7833333333333333 | 0 |
| 0.7840277777777778 | 0 |
| 0.7847222222222222 | 0 |
| 0.7854166666666668 | 0 |
| 0.7861111111111111 | 0 |
| 0.7868055555555555 | 0 |
| 0.7875 | 0 |
| 0.7881944444444445 | 0 |
| 0.7888888888888889 | 0 |
| 0.7895833333333333 | 0 |
| 0.7902777777777777 | 0 |
| 0.7909722222222223 | 0 |
| 0.7916666666666666 | 0 |
| 0.7923611111111111 | 0 |
| 0.7930555555555556 | 0 |
| 0.7937500000000001 | 0 |
| 0.7944444444444444 | 0 |
| 0.7951388888888888 | 0 |
| 0.7958333333333334 | 0 |
| 0.7965277777777778 | 0 |
| 0.7972222222222222 | 0 |
| 0.7979166666666666 | 0 |
| 0.7986111111111112 | 0 |
| 0.7993055555555556 | 0 |
| 0.7999999999999999 | 0 |
| 0.8006944444444444 | 0 |
| 0.8013888888888889 | 0 |
| 0.8020833333333334 | 0 |
| 0.8027777777777777 | 0 |
| 0.8034722222222223 | 0 |
| 0.8041666666666667 | 0 |
| 0.8048611111111111 | 0 |
| 0.8055555555555555 | 0 |
| 0.80625 | 0 |
| 0.8069444444444445 | 0 |
| 0.8076388888888889 | 0 |
| 0.8083333333333332 | 0 |
| 0.8090277777777778 | 0 |
| 0.8097222222222222 | 0 |
| 0.8104166666666667 | 0 |
| 0.811111111111111 | 0 |
| 0.8118055555555556 | 0 |
| 0.8125 | 0 |
| 0.8131944444444444 | 0 |
| 0.813888888888889 | 0 |
| 0.8145833333333333 | 0 |
| 0.8152777777777778 | 0 |
| 0.8159722222222222 | 0 |
| 0.8166666666666668 | 0 |
| 0.8173611111111111 | 0 |
| 0.8180555555555555 | 0 |
| 0.81875 | 0 |
| 0.8194444444444445 | 0 |
| 0.8201388888888889 | 0 |
| 0.8208333333333333 | 0 |
| 0.8215277777777777 | 0 |
| 0.8222222222222223 | 0 |
| 0.8229166666666666 | 0 |
| 0.8236111111111111 | 0 |
| 0.8243055555555556 | 0 |
| 0.8250000000000001 | 0 |
| 0.8256944444444444 | 0 |
| 0.8263888888888888 | 0 |
| 0.8270833333333334 | 0 |
| 0.8277777777777778 | 0 |
| 0.8284722222222222 | 0 |
| 0.8291666666666666 | 0 |
| 0.8298611111111112 | 0 |
| 0.8305555555555556 | 0 |
| 0.8312499999999999 | 0 |
| 0.8319444444444444 | 0 |
| 0.8326388888888889 | 0 |
| 0.8333333333333334 | 0 |
| 0.8340277777777777 | 0 |
| 0.8347222222222223 | 0 |
| 0.8354166666666667 | 0 |
| 0.8361111111111111 | 0 |
| 0.8368055555555555 | 0 |
| 0.8375 | 0 |
| 0.8381944444444445 | 0 |
| 0.8388888888888889 | 0 |
| 0.8395833333333332 | 0 |
| 0.8402777777777778 | 0 |
| 0.8409722222222222 | 0 |
| 0.8416666666666667 | 0 |
| 0.842361111111111 | 0 |
| 0.8430555555555556 | 0 |
| 0.84375 | 0 |
| 0.8444444444444444 | 0 |
| 0.845138888888889 | 0 |
| 0.8458333333333333 | 0 |
| 0.8465277777777778 | 0 |
| 0.8472222222222222 | 0 |
| 0.8479166666666668 | 0 |
| 0.8486111111111111 | 0 |
| 0.8493055555555555 | 0 |
| 0.85 | 0 |
| 0.8506944444444445 | 0 |
| 0.8513888888888889 | 0 |
| 0.8520833333333333 | 0 |
| 0.8527777777777777 | 0 |
| 0.8534722222222223 | 0 |
| 0.8541666666666666 | 0 |
| 0.8548611111111111 | 0 |
| 0.8555555555555556 | 0 |
| 0.8562500000000001 | 0 |
| 0.8569444444444444 | 0 |
| 0.8576388888888888 | 0 |
| 0.8583333333333334 | 0 |
| 0.8590277777777778 | 0 |
| 0.8597222222222222 | 0 |
| 0.8604166666666666 | 0 |
| 0.8611111111111112 | 0 |
| 0.8618055555555556 | 0 |
| 0.8624999999999999 | 0 |
| 0.8631944444444444 | 0 |
| 0.8638888888888889 | 0 |
| 0.8645833333333334 | 0 |
| 0.8652777777777777 | 0 |
| 0.8659722222222223 | 0 |
| 0.8666666666666667 | 0 |
| 0.8673611111111111 | 0 |
| 0.8680555555555555 | 0 |
| 0.86875 | 0 |
| 0.8694444444444445 | 0 |
| 0.8701388888888889 | 0 |
| 0.8708333333333332 | 0 |
| 0.8715277777777778 | 0 |
| 0.8722222222222222 | 0 |
| 0.8729166666666667 | 0 |
| 0.873611111111111 | 0 |
| 0.8743055555555556 | 0 |
| 0.875 | 0 |
| 0.8756944444444444 | 0 |
| 0.876388888888889 | 0 |
| 0.8770833333333333 | 0 |
| 0.8777777777777778 | 0 |
| 0.8784722222222222 | 0 |
| 0.8791666666666668 | 0 |
| 0.8798611111111111 | 0 |
| 0.8805555555555555 | 0 |
| 0.88125 | 0 |
| 0.8819444444444445 | 0 |
| 0.8826388888888889 | 0 |
| 0.8833333333333333 | 0 |
| 0.8840277777777777 | 0 |
| 0.8847222222222223 | 0 |
| 0.8854166666666666 | 0 |
| 0.8861111111111111 | 0 |
| 0.8868055555555556 | 0 |
| 0.8875000000000001 | 0 |
| 0.8881944444444444 | 0 |
| 0.8888888888888888 | 0 |
| 0.8895833333333334 | 0 |
| 0.8902777777777778 | 0 |
| 0.8909722222222222 | 0 |
| 0.8916666666666666 | 0 |
| 0.8923611111111112 | 0 |
| 0.8930555555555556 | 0 |
| 0.8937499999999999 | 0 |
| 0.8944444444444444 | 0 |
| 0.8951388888888889 | 0 |
| 0.8958333333333334 | 0 |
| 0.8965277777777777 | 0 |
| 0.8972222222222223 | 0 |
| 0.8979166666666667 | 0 |
| 0.8986111111111111 | 0 |
| 0.8993055555555555 | 0 |
| 0.9 | 0 |
| 0.9006944444444445 | 0 |
| 0.9013888888888889 | 0 |
| 0.9020833333333332 | 0 |
| 0.9027777777777778 | 0 |
| 0.9034722222222222 | 0 |
| 0.9041666666666667 | 0 |
| 0.904861111111111 | 0 |
| 0.9055555555555556 | 0 |
| 0.90625 | 0 |
| 0.9069444444444444 | 0 |
| 0.907638888888889 | 0 |
| 0.9083333333333333 | 0 |
| 0.9090277777777778 | 0 |
| 0.9097222222222222 | 0 |
| 0.9104166666666668 | 0 |
| 0.9111111111111111 | 0 |
| 0.9118055555555555 | 0 |
| 0.9125 | 0 |
| 0.9131944444444445 | 0 |
| 0.9138888888888889 | 0 |
| 0.9145833333333333 | 0 |
| 0.9152777777777777 | 0 |
| 0.9159722222222223 | 0 |
| 0.9166666666666666 | 0 |
| 0.9173611111111111 | 0 |
| 0.9180555555555556 | 0 |
| 0.9187500000000001 | 0 |
| 0.9194444444444444 | 0 |
| 0.9201388888888888 | 0 |
| 0.9208333333333334 | 0 |
| 0.9215277777777778 | 0 |
| 0.9222222222222222 | 0 |
| 0.9229166666666666 | 0 |
| 0.9236111111111112 | 0 |
| 0.9243055555555556 | 0 |
| 0.9249999999999999 | 0 |
| 0.9256944444444444 | 0 |
| 0.9263888888888889 | 0 |
| 0.9270833333333334 | 0 |
| 0.9277777777777777 | 0 |
| 0.9284722222222223 | 0 |
| 0.9291666666666667 | 0 |
| 0.9298611111111111 | 0 |
| 0.9305555555555555 | 0 |
| 0.93125 | 0 |
| 0.9319444444444445 | 0 |
| 0.9326388888888889 | 0 |
| 0.9333333333333332 | 0 |
| 0.9340277777777778 | 0 |
| 0.9347222222222222 | 0 |
| 0.9354166666666667 | 0 |
| 0.936111111111111 | 0 |
| 0.9368055555555556 | 0 |
| 0.9375 | 0 |
| 0.9381944444444444 | 0 |
| 0.938888888888889 | 0 |
| 0.9395833333333333 | 0 |
| 0.9402777777777778 | 0 |
| 0.9409722222222222 | 0 |
| 0.9416666666666668 | 0 |
| 0.9423611111111111 | 0 |
| 0.9430555555555555 | 0 |
| 0.94375 | 0 |
| 0.9444444444444445 | 0 |
| 0.9451388888888889 | 0 |
| 0.9458333333333333 | 0 |
| 0.9465277777777777 | 0 |
| 0.9472222222222223 | 0 |
| 0.9479166666666666 | 0 |
| 0.9486111111111111 | 0 |
| 0.9493055555555556 | 0 |
| 0.9500000000000001 | 0 |
| 0.9506944444444444 | 0 |
| 0.9513888888888888 | 0 |
| 0.9520833333333334 | 0 |
| 0.9527777777777778 | 0 |
| 0.9534722222222222 | 0 |
| 0.9541666666666666 | 0 |
| 0.9548611111111112 | 0 |
| 0.9555555555555556 | 0 |
| 0.9562499999999999 | 0 |
| 0.9569444444444444 | 0 |
| 0.9576388888888889 | 0 |
| 0.9583333333333334 | 0 |
| 0.9590277777777777 | 0 |
| 0.9597222222222223 | 0 |
| 0.9604166666666667 | 0 |
| 0.9611111111111111 | 0 |
| 0.9618055555555555 | 0 |
| 0.9625 | 0 |
| 0.9631944444444445 | 0 |
| 0.9638888888888889 | 0 |
| 0.9645833333333332 | 0 |
| 0.9652777777777778 | 0 |
| 0.9659722222222222 | 0 |
| 0.9666666666666667 | 0 |
| 0.967361111111111 | 0 |
| 0.9680555555555556 | 0 |
| 0.96875 | 0 |
| 0.9694444444444444 | 0 |
| 0.970138888888889 | 0 |
| 0.9708333333333333 | 0 |
| 0.9715277777777778 | 0 |
| 0.9722222222222222 | 0 |
| 0.9729166666666668 | 0 |
| 0.9736111111111111 | 0 |
| 0.9743055555555555 | 0 |
| 0.975 | 0 |
| 0.9756944444444445 | 0 |
| 0.9763888888888889 | 0 |
| 0.9770833333333333 | 0 |
| 0.9777777777777777 | 0 |
| 0.9784722222222223 | 0 |
| 0.9791666666666666 | 0 |
| 0.9798611111111111 | 0 |
| 0.9805555555555556 | 0 |
| 0.9812500000000001 | 0 |
| 0.9819444444444444 | 0 |
| 0.9826388888888888 | 0 |
| 0.9833333333333334 | 0 |
| 0.9840277777777778 | 0 |
| 0.9847222222222222 | 0 |
| 0.9854166666666666 | 0 |
| 0.9861111111111112 | 0 |
| 0.9868055555555556 | 0 |
| 0.9874999999999999 | 0 |
| 0.9881944444444444 | 0 |
| 0.9888888888888889 | 0 |
| 0.9895833333333334 | 0 |
| 0.9902777777777777 | 0 |
| 0.9909722222222223 | 0 |
| 0.9916666666666667 | 0 |
| 0.9923611111111111 | 0 |
| 0.9930555555555555 | 0 |
| 0.99375 | 0 |
| 0.9944444444444445 | 0 |
| 0.9951388888888889 | 0 |
| 0.9958333333333332 | 0 |
| 0.9965277777777778 | 0 |
| 0.9972222222222222 | 0 |
| 0.9979166666666667 | 0 |
| 0.998611111111111 | 0 |
| 0.9993055555555556 | 0 |